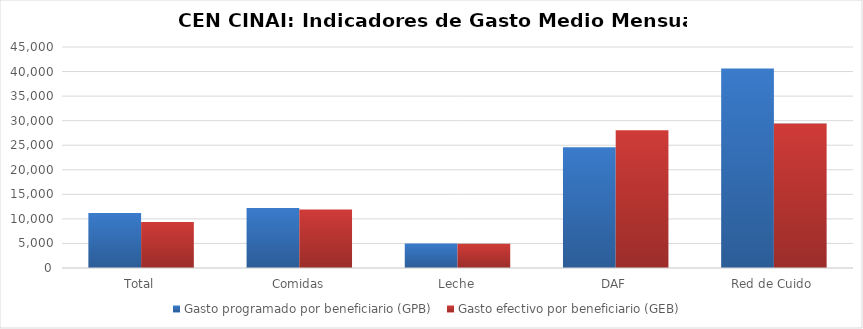
| Category | Gasto programado por beneficiario (GPB)  | Gasto efectivo por beneficiario (GEB)  |
|---|---|---|
| Total | 11203.727 | 9386.165 |
| Comidas | 12238.165 | 11932.003 |
| Leche | 5001.833 | 4940.253 |
| DAF | 24597.138 | 28026.156 |
| Red de Cuido | 40635.14 | 29421.282 |